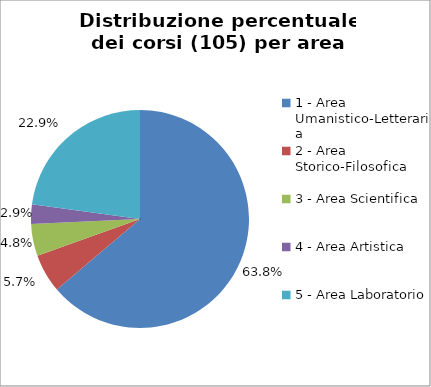
| Category | Nr. Corsi |
|---|---|
| 1 - Area Umanistico-Letteraria | 67 |
| 2 - Area Storico-Filosofica | 6 |
| 3 - Area Scientifica | 5 |
| 4 - Area Artistica | 3 |
| 5 - Area Laboratorio | 24 |